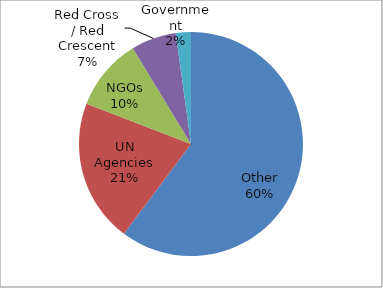
| Category | Sum of USD committed/contributed |
|---|---|
| Other | 72166221 |
| UN Agencies | 24694456 |
| NGOs | 12541202 |
| Red Cross / Red Crescent | 7809356 |
| Government | 2609365 |